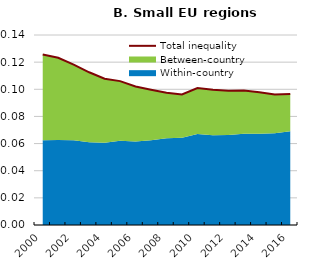
| Category | Total inequality |
|---|---|
| 2000.0 | 0.126 |
| 2001.0 | 0.123 |
| 2002.0 | 0.118 |
| 2003.0 | 0.113 |
| 2004.0 | 0.108 |
| 2005.0 | 0.106 |
| 2006.0 | 0.102 |
| 2007.0 | 0.1 |
| 2008.0 | 0.097 |
| 2009.0 | 0.096 |
| 2010.0 | 0.101 |
| 2011.0 | 0.1 |
| 2012.0 | 0.099 |
| 2013.0 | 0.099 |
| 2014.0 | 0.098 |
| 2015.0 | 0.096 |
| 2016.0 | 0.096 |